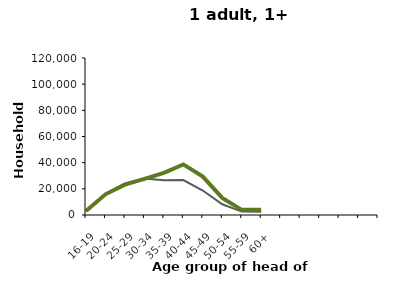
| Category | Series 1 | Series 2 |
|---|---|---|
| 16-19 | 2796 | 3133 |
| 20-24 | 16112 | 15798 |
| 25-29 | 24078 | 23161 |
| 30-34 | 27853 | 27629 |
| 35-39 | 26501 | 32152 |
| 40-44 | 26706 | 38681 |
| 45-49 | 18699 | 29325 |
| 50-54 | 8224 | 13016 |
| 55-59 | 2580 | 3945 |
| 60+ | 2503 | 3926 |